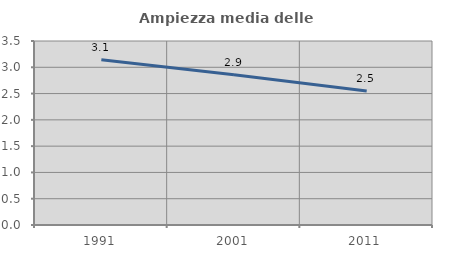
| Category | Ampiezza media delle famiglie |
|---|---|
| 1991.0 | 3.144 |
| 2001.0 | 2.859 |
| 2011.0 | 2.548 |